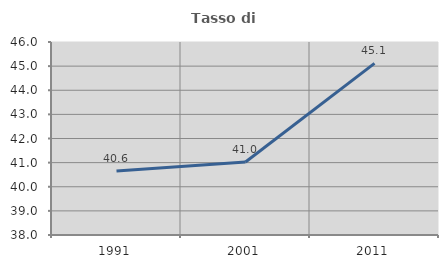
| Category | Tasso di occupazione   |
|---|---|
| 1991.0 | 40.649 |
| 2001.0 | 41.026 |
| 2011.0 | 45.114 |